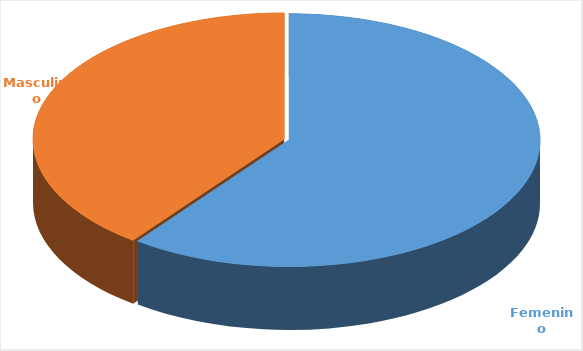
| Category | Cantidad  |
|---|---|
| Femenino | 3733 |
| Masculino | 2461 |